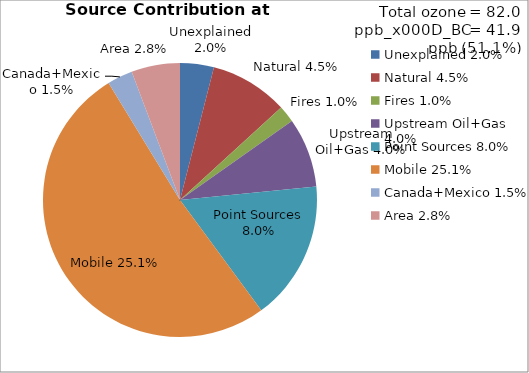
| Category | [ppb] |
|---|---|
| Unexplained 2.0% | 1.6 |
| Natural 4.5% | 3.7 |
| Fires 1.0% | 0.8 |
| Upstream Oil+Gas 4.0% | 3.3 |
| Point Sources 8.0% | 6.6 |
| Mobile 25.1% | 20.6 |
| Canada+Mexico 1.5% | 1.2 |
| Area 2.8% | 2.3 |